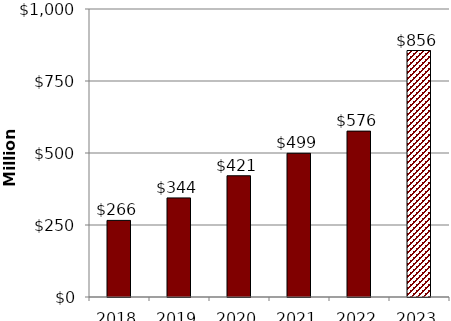
| Category | 2018 |
|---|---|
| 2018.0 | 266000 |
| 2019.0 | 344000 |
| 2020.0 | 421000 |
| 2021.0 | 499000 |
| 2022.0 | 576000 |
| 2023.0 | 855897.625 |